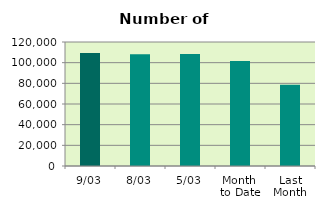
| Category | Series 0 |
|---|---|
| 9/03 | 109392 |
| 8/03 | 108048 |
| 5/03 | 108462 |
| Month 
to Date | 101496.571 |
| Last
Month | 78748.7 |